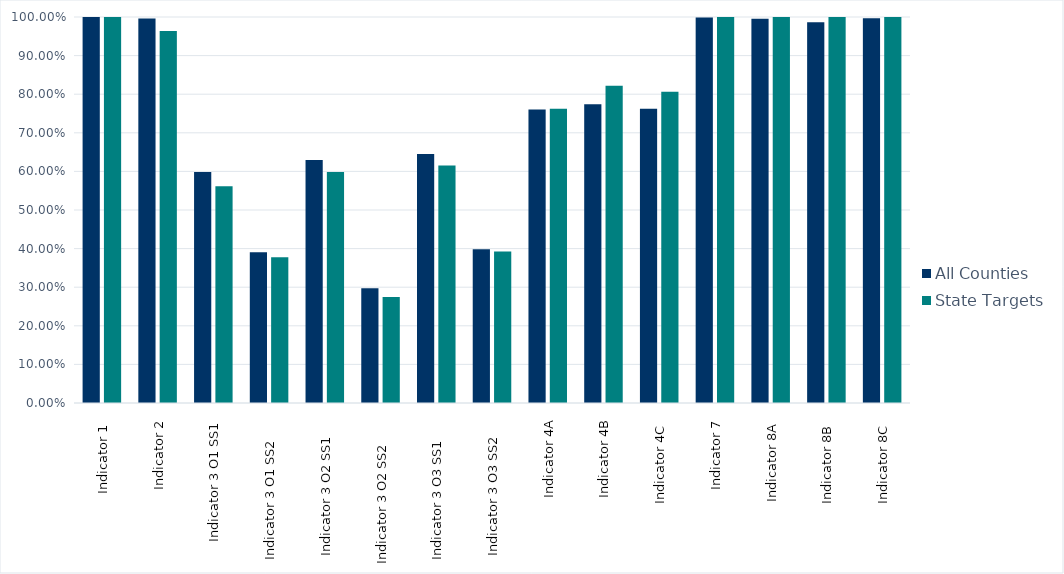
| Category | All Counties | State Targets |
|---|---|---|
| Indicator 1  | 1 | 1 |
| Indicator 2 | 0.996 | 0.964 |
| Indicator 3 O1 SS1 | 0.598 | 0.561 |
| Indicator 3 O1 SS2     | 0.391 | 0.378 |
| Indicator 3 O2 SS1    | 0.63 | 0.598 |
| Indicator 3 O2 SS2      | 0.297 | 0.274 |
| Indicator 3 O3 SS1     | 0.645 | 0.615 |
| Indicator 3 O3 SS2    | 0.398 | 0.392 |
| Indicator 4A | 0.76 | 0.762 |
| Indicator 4B | 0.774 | 0.822 |
| Indicator 4C  | 0.762 | 0.806 |
| Indicator 7 | 0.998 | 1 |
| Indicator 8A  | 0.995 | 1 |
| Indicator 8B  | 0.986 | 1 |
| Indicator 8C  | 0.997 | 1 |